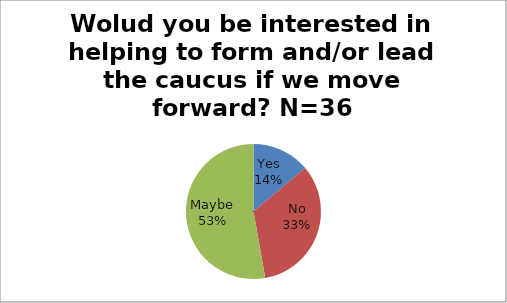
| Category | Wolud you be interested in helping to form and/or lead the caucus if we move forward? N=36 |
|---|---|
| Yes | 5 |
| No | 12 |
| Maybe | 19 |